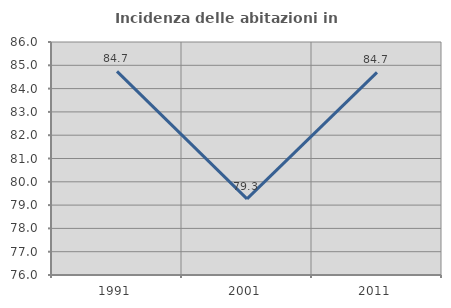
| Category | Incidenza delle abitazioni in proprietà  |
|---|---|
| 1991.0 | 84.74 |
| 2001.0 | 79.268 |
| 2011.0 | 84.697 |